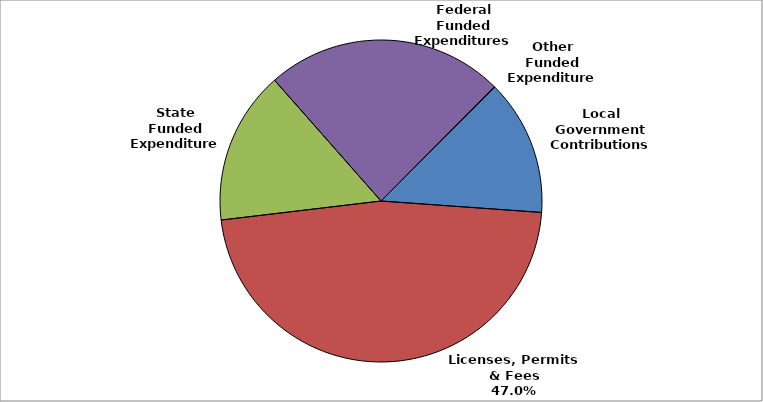
| Category | Series 0 |
|---|---|
| Local Government Contributions | 0.136 |
| Licenses, Permits & Fees | 0.47 |
| State Funded Expenditures | 0.154 |
| Federal Funded Expenditures | 0.239 |
| Other Funded Expenditures | 0.001 |